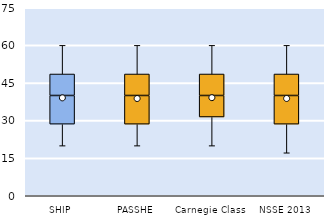
| Category | 25th | 50th | 75th |
|---|---|---|---|
| SHIP | 28.571 | 11.429 | 8.571 |
| PASSHE | 28.571 | 11.429 | 8.571 |
| Carnegie Class | 31.429 | 8.571 | 8.571 |
| NSSE 2013 | 28.571 | 11.429 | 8.571 |